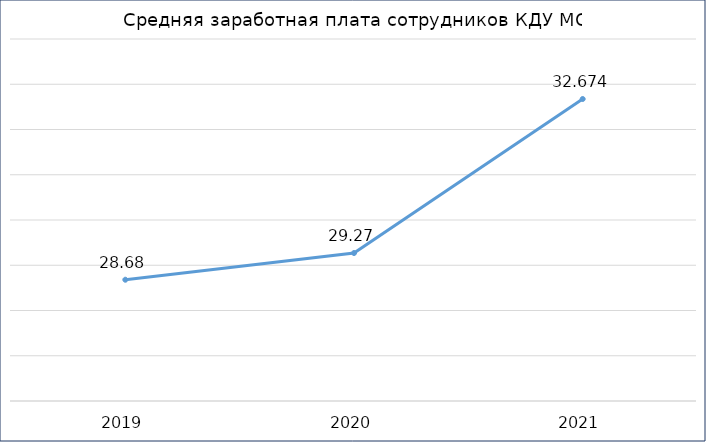
| Category | Series 1 | Series 2 |
|---|---|---|
| 2019.0 |  | 28.68 |
| 2020.0 |  | 29.27 |
| 2021.0 |  | 32.674 |